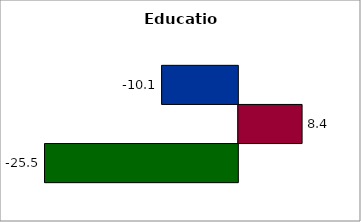
| Category | 50 states and D.C. | SREB states | State |
|---|---|---|---|
| 0 | -10.053 | 8.414 | -25.506 |